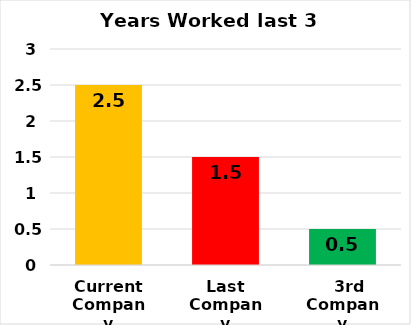
| Category | Series 0 |
|---|---|
| Current Company | 2.5 |
| Last Company | 1.5 |
|   3rd Company | 0.5 |